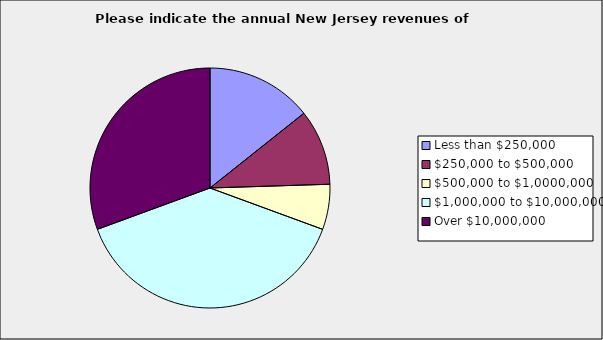
| Category | Series 0 |
|---|---|
| Less than $250,000 | 0.143 |
| $250,000 to $500,000 | 0.102 |
| $500,000 to $1,0000,000 | 0.061 |
| $1,000,000 to $10,000,000 | 0.388 |
| Over $10,000,000 | 0.306 |